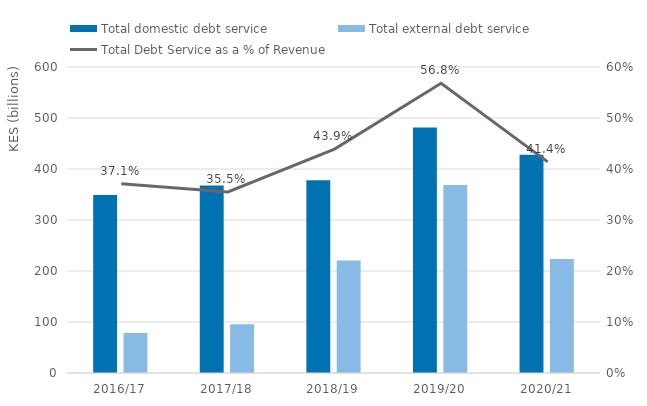
| Category | Total domestic debt service | Total external debt service |
|---|---|---|
| 2016/17 | 349010 | 78583 |
| 2017/18 | 367587 | 95623 |
| 2018/19 | 377870 | 220638 |
| 2019/20 | 481593 | 368478 |
| 2020/21 | 428033 | 223440 |